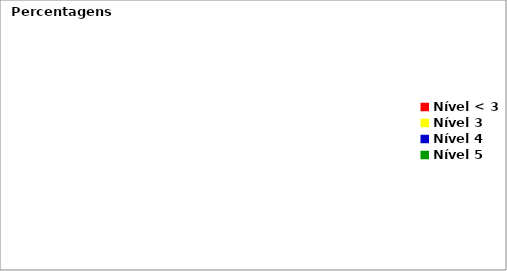
| Category | Series 0 | % |
|---|---|---|
| Nível < 3 | 0 |  |
| Nível 3 | 0 |  |
| Nível 4 | 0 |  |
| Nível 5 | 0 |  |